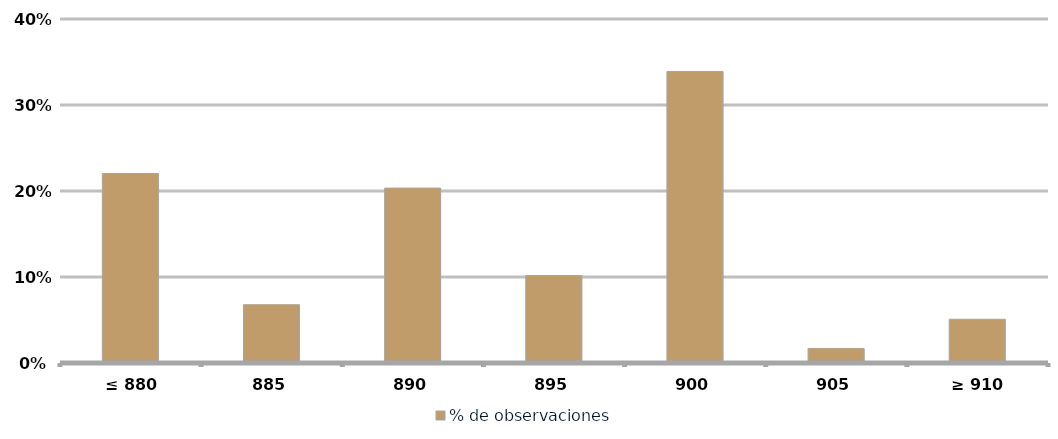
| Category | % de observaciones  |
|---|---|
|  ≤ 880  | 0.22 |
|  885  | 0.068 |
|  890  | 0.203 |
|  895  | 0.102 |
|  900  | 0.339 |
| 905 | 0.017 |
|  ≥ 910  | 0.051 |